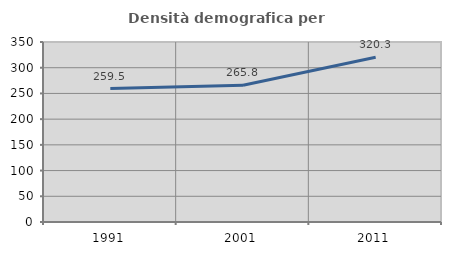
| Category | Densità demografica |
|---|---|
| 1991.0 | 259.487 |
| 2001.0 | 265.822 |
| 2011.0 | 320.279 |